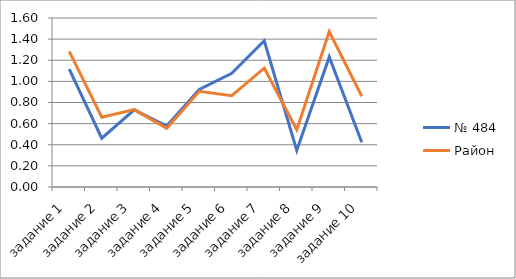
| Category | № 484 | Район |
|---|---|---|
| задание 1 | 1.115 | 1.284 |
| задание 2 | 0.462 | 0.661 |
| задание 3 | 0.731 | 0.733 |
| задание 4 | 0.577 | 0.555 |
| задание 5 | 0.923 | 0.906 |
| задание 6 | 1.077 | 0.865 |
| задание 7 | 1.385 | 1.127 |
| задание 8 | 0.346 | 0.543 |
| задание 9 | 1.231 | 1.472 |
| задание 10 | 0.423 | 0.859 |